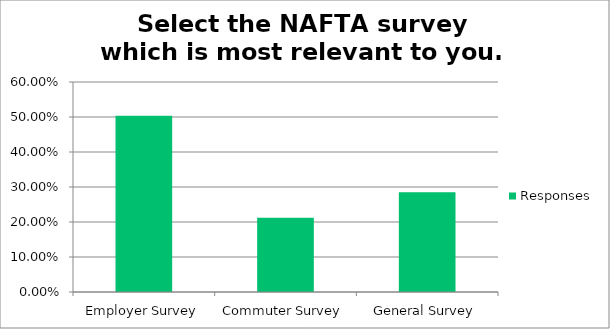
| Category | Responses |
|---|---|
| Employer Survey | 0.503 |
| Commuter Survey | 0.212 |
| General Survey | 0.285 |